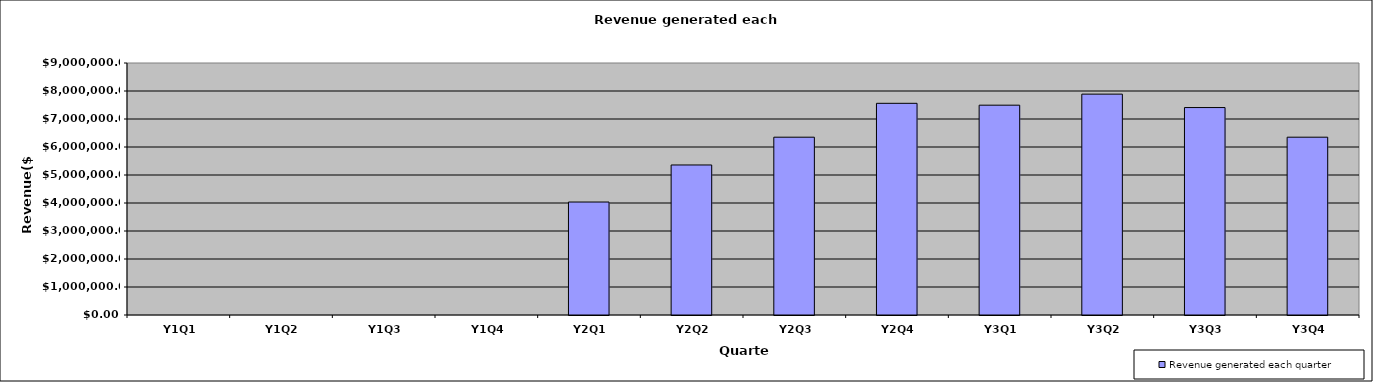
| Category | Revenue generated each quarter |
|---|---|
| Y1Q1 | 0 |
| Y1Q2 | 0 |
| Y1Q3 | 0 |
| Y1Q4 | 0 |
| Y2Q1 | 4035150 |
| Y2Q2 | 5358150 |
| Y2Q3 | 6350400 |
| Y2Q4 | 7560000 |
| Y3Q1 | 7493850 |
| Y3Q2 | 7888387.5 |
| Y3Q3 | 7408800 |
| Y3Q4 | 6350400 |